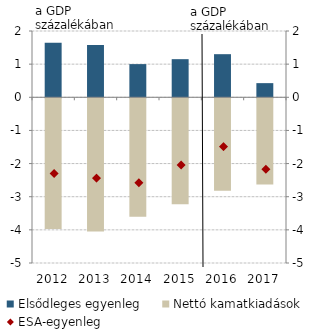
| Category | Elsődleges egyenleg |
|---|---|
| 2012.0 | 1.644 |
| 2013.0 | 1.58 |
| 2014.0 | 1.001 |
| 2015.0 | 1.15 |
| 2016.0 | 1.301 |
| 2017.0 | 0.427 |